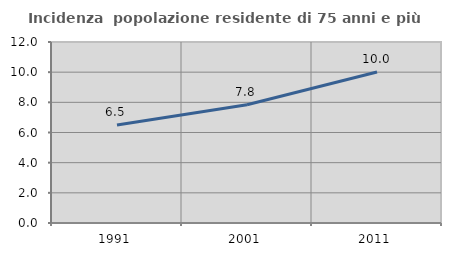
| Category | Incidenza  popolazione residente di 75 anni e più |
|---|---|
| 1991.0 | 6.495 |
| 2001.0 | 7.84 |
| 2011.0 | 10.015 |